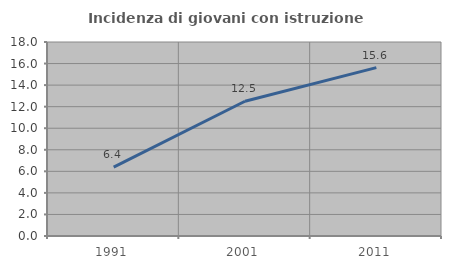
| Category | Incidenza di giovani con istruzione universitaria |
|---|---|
| 1991.0 | 6.383 |
| 2001.0 | 12.5 |
| 2011.0 | 15.625 |